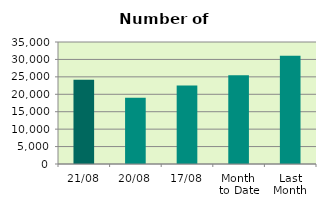
| Category | Series 0 |
|---|---|
| 21/08 | 24140 |
| 20/08 | 19012 |
| 17/08 | 22506 |
| Month 
to Date | 25484.4 |
| Last
Month | 31061.545 |